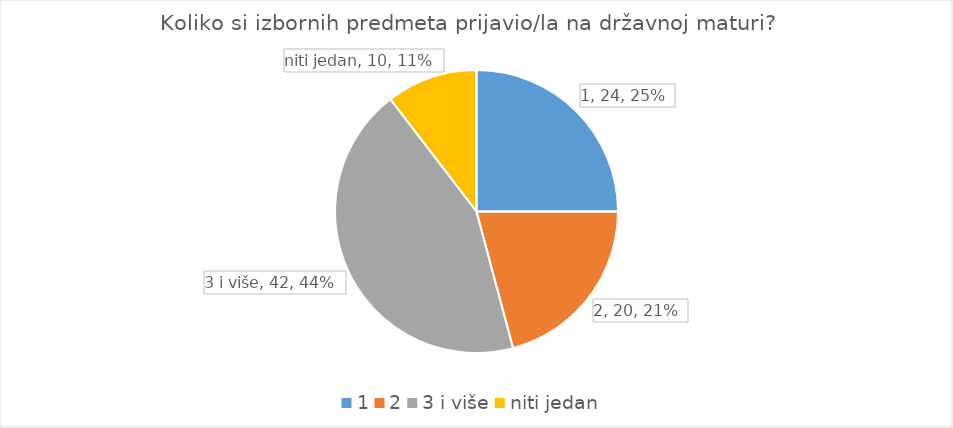
| Category | Series 0 |
|---|---|
| 1 | 24 |
| 2 | 20 |
| 3 i više | 42 |
| niti jedan | 10 |